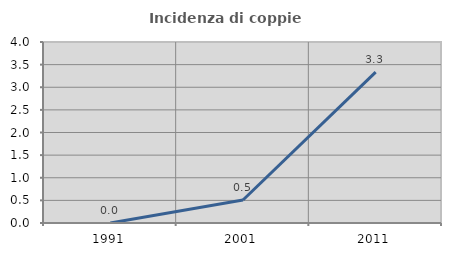
| Category | Incidenza di coppie miste |
|---|---|
| 1991.0 | 0 |
| 2001.0 | 0.508 |
| 2011.0 | 3.333 |